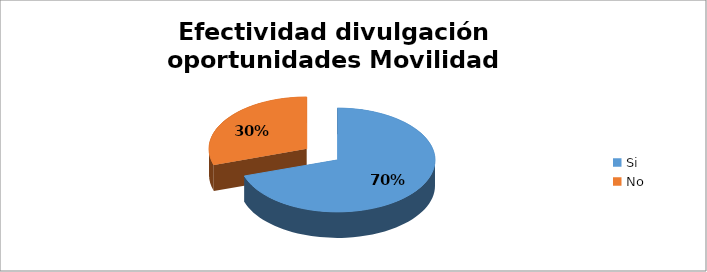
| Category | Porcentaje |
|---|---|
| Si | 0.7 |
| No | 0.3 |